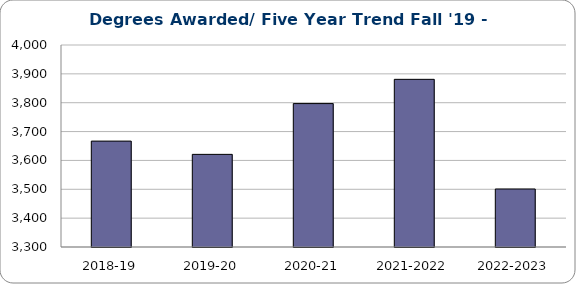
| Category | Series 0 |
|---|---|
| 2018-19 | 3667 |
| 2019-20 | 3621 |
| 2020-21 | 3797 |
| 2021-2022 | 3881 |
| 2022-2023 | 3501 |